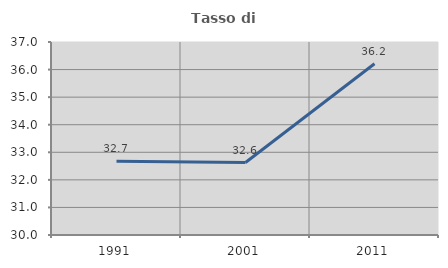
| Category | Tasso di occupazione   |
|---|---|
| 1991.0 | 32.674 |
| 2001.0 | 32.628 |
| 2011.0 | 36.209 |